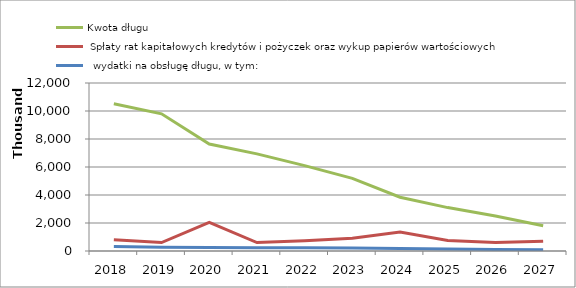
| Category | Kwota długu |  Spłaty rat kapitałowych kredytów i pożyczek oraz wykup papierów wartościowych |   wydatki na obsługę długu, w tym: |
|---|---|---|---|
| 2018.0 | 10515000 | 800000 | 325000 |
| 2019.0 | 9798000 | 600000 | 269000 |
| 2020.0 | 7645000 | 2040000 | 255000 |
| 2021.0 | 6936000 | 600000 | 240000 |
| 2022.0 | 6101000 | 730000 | 226000 |
| 2023.0 | 5191000 | 910000 | 208000 |
| 2024.0 | 3843000 | 1348000 | 180000 |
| 2025.0 | 3100000 | 743000 | 134000 |
| 2026.0 | 2500000 | 600000 | 112000 |
| 2027.0 | 1800000 | 700000 | 90000 |